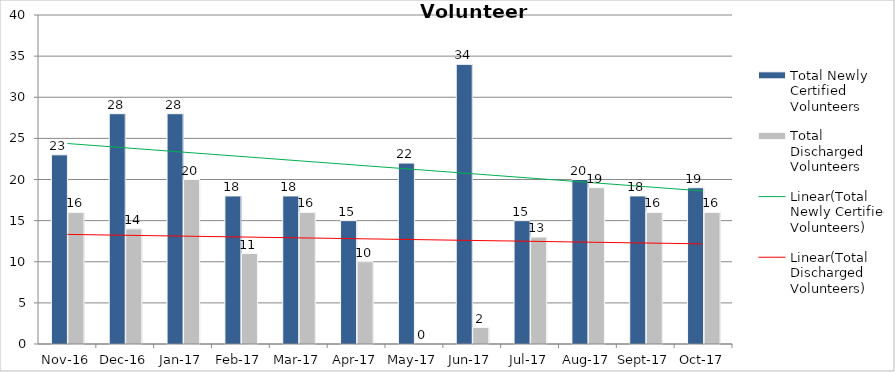
| Category | Total Newly Certified Volunteers | Total Discharged Volunteers |
|---|---|---|
| 2016-11-01 | 23 | 16 |
| 2016-12-01 | 28 | 14 |
| 2017-01-01 | 28 | 20 |
| 2017-02-01 | 18 | 11 |
| 2017-03-01 | 18 | 16 |
| 2017-04-01 | 15 | 10 |
| 2017-05-01 | 22 | 0 |
| 2017-06-01 | 34 | 2 |
| 2017-07-01 | 15 | 13 |
| 2017-08-01 | 20 | 19 |
| 2017-09-01 | 18 | 16 |
| 2017-10-01 | 19 | 16 |